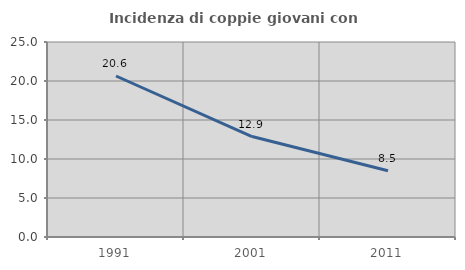
| Category | Incidenza di coppie giovani con figli |
|---|---|
| 1991.0 | 20.641 |
| 2001.0 | 12.877 |
| 2011.0 | 8.495 |